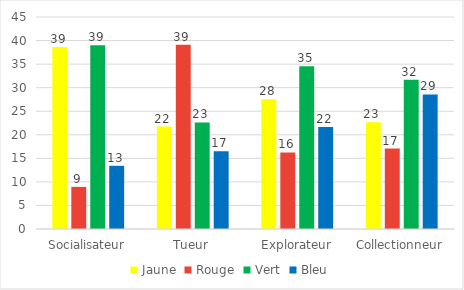
| Category | Jaune | Rouge | Vert | Bleu |
|---|---|---|---|---|
| Socialisateur | 38.618 | 8.943 | 39.024 | 13.415 |
| Tueur | 21.739 | 39.13 | 22.609 | 16.522 |
| Explorateur | 27.54 | 16.253 | 34.537 | 21.67 |
| Collectionneur | 22.671 | 17.081 | 31.677 | 28.571 |